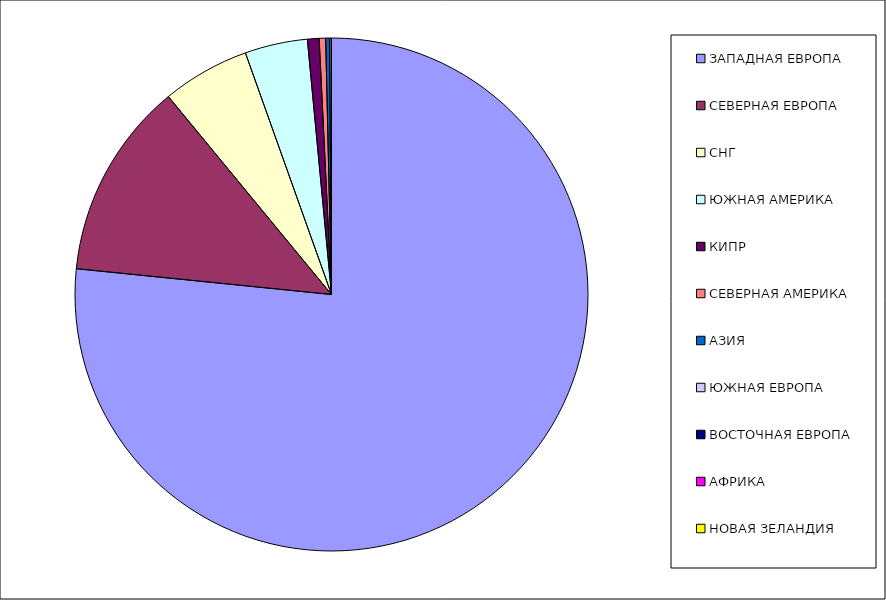
| Category | Оборот |
|---|---|
| ЗАПАДНАЯ ЕВРОПА | 0.766 |
| СЕВЕРНАЯ ЕВРОПА | 0.124 |
| СНГ | 0.055 |
| ЮЖНАЯ АМЕРИКА | 0.039 |
| КИПР | 0.007 |
| СЕВЕРНАЯ АМЕРИКА | 0.004 |
| АЗИЯ | 0.002 |
| ЮЖНАЯ ЕВРОПА | 0.001 |
| ВОСТОЧНАЯ ЕВРОПА | 0 |
| АФРИКА | 0 |
| НОВАЯ ЗЕЛАНДИЯ | 0 |